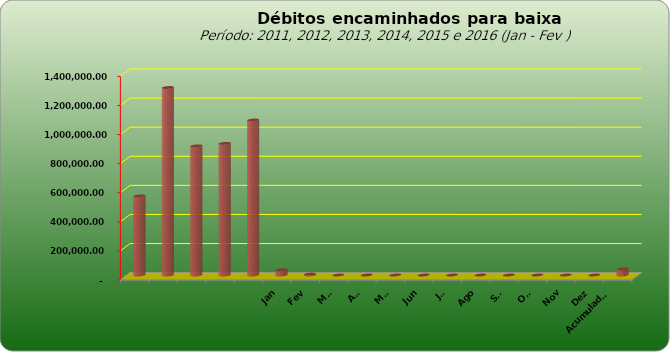
| Category |  543.796,20   1.289.053,69   887.573,08   905.052,31   1.065.434,28   35.964,03   6.417,54   -     -     -     -     -     -     -     -     -     -     42.381,57  |
|---|---|
|  | 543796.2 |
|  | 1289053.69 |
|  | 887573.08 |
|  | 905052.31 |
|  | 1065434.28 |
| Jan | 35964.03 |
| Fev | 6417.54 |
| Mar | 0 |
| Abr | 0 |
| Mai | 0 |
| Jun | 0 |
| Jul | 0 |
| Ago | 0 |
| Set | 0 |
| Out | 0 |
| Nov | 0 |
| Dez | 0 |
| Acumulado
2016 | 42381.57 |